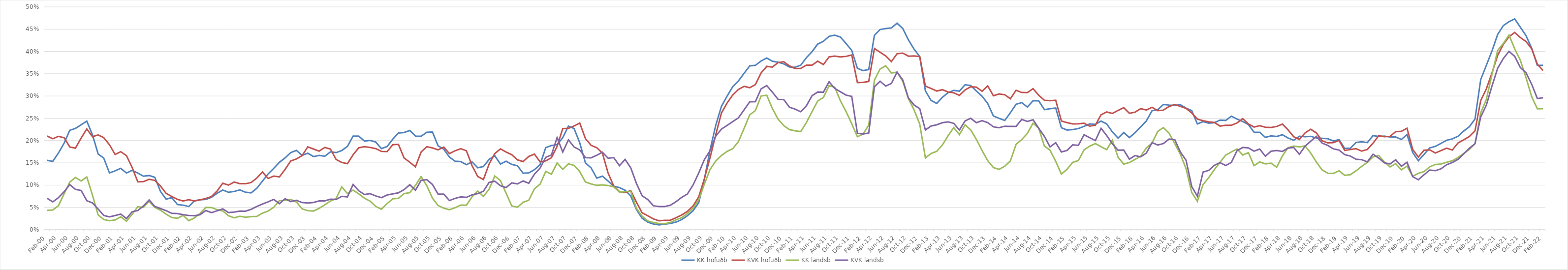
| Category | KK höfuðb | KVK höfuðb | KK landsb | KVK landsb |
|---|---|---|---|---|
| feb.00 | 0.156 | 0.21 | 0.043 | 0.07 |
| mar.00 | 0.153 | 0.204 | 0.044 | 0.062 |
| apr.00 | 0.172 | 0.209 | 0.054 | 0.072 |
| maí.00 | 0.194 | 0.206 | 0.081 | 0.085 |
| jún.00 | 0.223 | 0.186 | 0.107 | 0.101 |
| júl.00 | 0.227 | 0.183 | 0.117 | 0.09 |
| ágú.00 | 0.235 | 0.205 | 0.109 | 0.088 |
| sep.00 | 0.244 | 0.226 | 0.118 | 0.065 |
| okt.00 | 0.213 | 0.209 | 0.077 | 0.06 |
| nóv.00 | 0.17 | 0.213 | 0.033 | 0.046 |
| des.00 | 0.16 | 0.206 | 0.023 | 0.032 |
| jan.01 | 0.127 | 0.191 | 0.02 | 0.029 |
| feb.01 | 0.132 | 0.169 | 0.022 | 0.032 |
| mar.01 | 0.138 | 0.175 | 0.029 | 0.035 |
| apr.01 | 0.127 | 0.166 | 0.019 | 0.025 |
| maí.01 | 0.133 | 0.14 | 0.034 | 0.04 |
| jún.01 | 0.127 | 0.107 | 0.051 | 0.043 |
| júl.01 | 0.12 | 0.108 | 0.05 | 0.053 |
| ágú.01 | 0.122 | 0.113 | 0.063 | 0.067 |
| sep.01 | 0.118 | 0.111 | 0.05 | 0.052 |
| okt.01 | 0.086 | 0.098 | 0.044 | 0.047 |
| nóv.01 | 0.068 | 0.081 | 0.035 | 0.043 |
| des.01 | 0.072 | 0.074 | 0.027 | 0.037 |
| jan.02 | 0.056 | 0.068 | 0.026 | 0.036 |
| feb.02 | 0.055 | 0.064 | 0.032 | 0.034 |
| mar.02 | 0.052 | 0.067 | 0.02 | 0.032 |
| apr.02 | 0.065 | 0.064 | 0.026 | 0.031 |
| maí.02 | 0.067 | 0.067 | 0.037 | 0.034 |
| jún.02 | 0.068 | 0.07 | 0.05 | 0.043 |
| júl.02 | 0.073 | 0.074 | 0.05 | 0.038 |
| ágú.02 | 0.082 | 0.087 | 0.045 | 0.042 |
| sep.02 | 0.089 | 0.104 | 0.042 | 0.047 |
| okt.02 | 0.084 | 0.1 | 0.031 | 0.038 |
| nóv.02 | 0.086 | 0.107 | 0.027 | 0.039 |
| des.02 | 0.089 | 0.103 | 0.03 | 0.042 |
| jan.03 | 0.084 | 0.103 | 0.028 | 0.042 |
| feb.03 | 0.083 | 0.106 | 0.029 | 0.046 |
| mar.03 | 0.093 | 0.116 | 0.03 | 0.052 |
| apr.03 | 0.109 | 0.129 | 0.037 | 0.058 |
| maí.03 | 0.125 | 0.115 | 0.042 | 0.062 |
| jún.03 | 0.138 | 0.12 | 0.05 | 0.068 |
| júl.03 | 0.151 | 0.118 | 0.065 | 0.059 |
| ágú.03 | 0.161 | 0.135 | 0.066 | 0.069 |
| sep.03 | 0.173 | 0.154 | 0.068 | 0.063 |
| okt.03 | 0.178 | 0.159 | 0.062 | 0.066 |
| nóv.03 | 0.167 | 0.166 | 0.047 | 0.061 |
| des.03 | 0.172 | 0.186 | 0.043 | 0.06 |
| jan.04 | 0.164 | 0.181 | 0.042 | 0.061 |
| feb.04 | 0.167 | 0.176 | 0.048 | 0.064 |
| mar.04 | 0.165 | 0.185 | 0.056 | 0.065 |
| apr.04 | 0.175 | 0.181 | 0.064 | 0.068 |
| maí.04 | 0.173 | 0.158 | 0.07 | 0.068 |
| jún.04 | 0.178 | 0.151 | 0.096 | 0.075 |
| júl.04 | 0.187 | 0.148 | 0.081 | 0.074 |
| ágú.04 | 0.21 | 0.168 | 0.089 | 0.101 |
| sep.04 | 0.21 | 0.184 | 0.08 | 0.087 |
| okt.04 | 0.199 | 0.186 | 0.071 | 0.079 |
| nóv.04 | 0.2 | 0.185 | 0.064 | 0.081 |
| des.04 | 0.197 | 0.182 | 0.052 | 0.076 |
| jan.05 | 0.182 | 0.176 | 0.046 | 0.072 |
| feb.05 | 0.187 | 0.175 | 0.059 | 0.078 |
| mar.05 | 0.203 | 0.191 | 0.069 | 0.08 |
| apr.05 | 0.217 | 0.191 | 0.07 | 0.083 |
| maí.05 | 0.218 | 0.161 | 0.081 | 0.09 |
| jún.05 | 0.223 | 0.151 | 0.083 | 0.101 |
| júl.05 | 0.21 | 0.141 | 0.099 | 0.089 |
| ágú.05 | 0.21 | 0.174 | 0.119 | 0.111 |
| sep.05 | 0.219 | 0.186 | 0.099 | 0.112 |
| okt.05 | 0.219 | 0.184 | 0.071 | 0.102 |
| nóv.05 | 0.188 | 0.179 | 0.054 | 0.08 |
| des.05 | 0.181 | 0.185 | 0.048 | 0.08 |
| jan.06 | 0.163 | 0.171 | 0.045 | 0.065 |
| feb.06 | 0.154 | 0.177 | 0.049 | 0.07 |
| mar.06 | 0.153 | 0.182 | 0.055 | 0.074 |
| apr.06 | 0.146 | 0.177 | 0.055 | 0.072 |
| maí.06 | 0.152 | 0.143 | 0.074 | 0.078 |
| jún.06 | 0.139 | 0.119 | 0.087 | 0.081 |
| júl.06 | 0.142 | 0.113 | 0.075 | 0.086 |
| ágú.06 | 0.158 | 0.147 | 0.091 | 0.106 |
| sep.06 | 0.166 | 0.171 | 0.121 | 0.109 |
| okt.06 | 0.147 | 0.181 | 0.11 | 0.099 |
| nóv.06 | 0.154 | 0.174 | 0.082 | 0.094 |
| des.06 | 0.147 | 0.168 | 0.053 | 0.105 |
| jan.07 | 0.143 | 0.157 | 0.05 | 0.103 |
| feb.07 | 0.127 | 0.153 | 0.061 | 0.109 |
| mar.07 | 0.127 | 0.164 | 0.066 | 0.104 |
| apr.07 | 0.135 | 0.169 | 0.092 | 0.125 |
| maí.07 | 0.146 | 0.152 | 0.102 | 0.138 |
| jún.07 | 0.184 | 0.155 | 0.131 | 0.162 |
| júl.07 | 0.189 | 0.161 | 0.124 | 0.168 |
| ágú.07 | 0.191 | 0.187 | 0.15 | 0.207 |
| sep.07 | 0.207 | 0.227 | 0.136 | 0.174 |
| okt.07 | 0.232 | 0.227 | 0.148 | 0.202 |
| nóv.07 | 0.227 | 0.233 | 0.144 | 0.186 |
| des.07 | 0.195 | 0.239 | 0.13 | 0.179 |
| jan.08 | 0.15 | 0.204 | 0.107 | 0.162 |
| feb.08 | 0.139 | 0.189 | 0.103 | 0.161 |
| mar.08 | 0.116 | 0.184 | 0.099 | 0.167 |
| apr.08 | 0.12 | 0.172 | 0.101 | 0.174 |
| maí.08 | 0.109 | 0.127 | 0.099 | 0.16 |
| jún.08 | 0.098 | 0.098 | 0.096 | 0.162 |
| júl.08 | 0.094 | 0.085 | 0.084 | 0.144 |
| ágú.08 | 0.089 | 0.083 | 0.085 | 0.158 |
| sep.08 | 0.076 | 0.088 | 0.086 | 0.139 |
| okt.08 | 0.045 | 0.062 | 0.048 | 0.104 |
| nóv.08 | 0.026 | 0.038 | 0.03 | 0.076 |
| des.08 | 0.017 | 0.031 | 0.02 | 0.068 |
| jan.09 | 0.013 | 0.024 | 0.016 | 0.054 |
| feb.09 | 0.011 | 0.02 | 0.014 | 0.052 |
| mar.09 | 0.012 | 0.021 | 0.013 | 0.052 |
| apr.09 | 0.014 | 0.021 | 0.016 | 0.055 |
| maí.09 | 0.017 | 0.027 | 0.022 | 0.063 |
| jún.09 | 0.023 | 0.033 | 0.027 | 0.073 |
| júl.09 | 0.031 | 0.041 | 0.036 | 0.08 |
| ágú.09 | 0.043 | 0.053 | 0.048 | 0.1 |
| sep.09 | 0.061 | 0.074 | 0.067 | 0.127 |
| okt.09 | 0.114 | 0.115 | 0.102 | 0.157 |
| nóv.09 | 0.179 | 0.162 | 0.135 | 0.177 |
| des.09 | 0.234 | 0.213 | 0.154 | 0.21 |
| jan.10 | 0.277 | 0.262 | 0.166 | 0.226 |
| feb.10 | 0.3 | 0.284 | 0.176 | 0.234 |
| mar.10 | 0.321 | 0.302 | 0.182 | 0.243 |
| apr.10 | 0.334 | 0.315 | 0.198 | 0.251 |
| maí.10 | 0.351 | 0.322 | 0.227 | 0.269 |
| jún.10 | 0.368 | 0.319 | 0.258 | 0.287 |
| júl.10 | 0.369 | 0.326 | 0.267 | 0.287 |
| ágú.10 | 0.379 | 0.352 | 0.3 | 0.316 |
| sep.10 | 0.385 | 0.367 | 0.302 | 0.324 |
| okt.10 | 0.378 | 0.365 | 0.272 | 0.309 |
| nóv.10 | 0.376 | 0.375 | 0.248 | 0.293 |
| des.10 | 0.372 | 0.377 | 0.233 | 0.292 |
| jan.11 | 0.365 | 0.368 | 0.225 | 0.275 |
| feb.11 | 0.365 | 0.362 | 0.222 | 0.271 |
| mar.11 | 0.369 | 0.362 | 0.22 | 0.265 |
| apr.11 | 0.386 | 0.369 | 0.24 | 0.278 |
| maí.11 | 0.4 | 0.369 | 0.265 | 0.301 |
| jún.11 | 0.417 | 0.378 | 0.289 | 0.309 |
| júl.11 | 0.423 | 0.37 | 0.297 | 0.308 |
| ágú.11 | 0.434 | 0.388 | 0.323 | 0.332 |
| sep.11 | 0.436 | 0.39 | 0.32 | 0.317 |
| okt.11 | 0.432 | 0.388 | 0.289 | 0.309 |
| nóv.11 | 0.418 | 0.389 | 0.265 | 0.302 |
| des.11 | 0.402 | 0.392 | 0.238 | 0.299 |
| jan.12 | 0.362 | 0.33 | 0.209 | 0.216 |
| feb.12 | 0.357 | 0.331 | 0.215 | 0.215 |
| mar.12 | 0.359 | 0.333 | 0.234 | 0.217 |
| apr.12 | 0.436 | 0.407 | 0.336 | 0.321 |
| maí.12 | 0.449 | 0.398 | 0.361 | 0.333 |
| jún.12 | 0.451 | 0.39 | 0.368 | 0.322 |
| júl.12 | 0.453 | 0.377 | 0.352 | 0.328 |
| ágú.12 | 0.463 | 0.395 | 0.354 | 0.354 |
| sep.12 | 0.452 | 0.396 | 0.333 | 0.336 |
| okt.12 | 0.426 | 0.389 | 0.294 | 0.295 |
| nóv.12 | 0.405 | 0.39 | 0.269 | 0.28 |
| des.12 | 0.388 | 0.389 | 0.237 | 0.272 |
| jan.13 | 0.312 | 0.322 | 0.161 | 0.224 |
| feb.13 | 0.29 | 0.317 | 0.171 | 0.233 |
| mar.13 | 0.283 | 0.311 | 0.176 | 0.235 |
| apr.13 | 0.297 | 0.314 | 0.19 | 0.24 |
| maí.13 | 0.307 | 0.309 | 0.211 | 0.242 |
| jún.13 | 0.313 | 0.307 | 0.229 | 0.239 |
| júl.13 | 0.311 | 0.301 | 0.214 | 0.224 |
| ágú.13 | 0.325 | 0.314 | 0.235 | 0.244 |
| sep.13 | 0.323 | 0.321 | 0.224 | 0.25 |
| okt.13 | 0.311 | 0.32 | 0.203 | 0.24 |
| nóv.13 | 0.3 | 0.311 | 0.178 | 0.245 |
| des.13 | 0.283 | 0.323 | 0.155 | 0.24 |
| jan.14 | 0.255 | 0.301 | 0.139 | 0.231 |
| feb.14 | 0.25 | 0.305 | 0.135 | 0.229 |
| mar.14 | 0.245 | 0.303 | 0.142 | 0.232 |
| apr.14 | 0.262 | 0.294 | 0.154 | 0.232 |
| maí.14 | 0.281 | 0.313 | 0.191 | 0.232 |
| jún.14 | 0.285 | 0.308 | 0.202 | 0.248 |
| júl.14 | 0.275 | 0.308 | 0.216 | 0.243 |
| ágú.14 | 0.289 | 0.316 | 0.239 | 0.247 |
| sep.14 | 0.289 | 0.302 | 0.227 | 0.228 |
| okt.14 | 0.269 | 0.291 | 0.188 | 0.209 |
| nóv.14 | 0.272 | 0.289 | 0.178 | 0.186 |
| des.14 | 0.273 | 0.29 | 0.153 | 0.195 |
| jan.15 | 0.229 | 0.244 | 0.125 | 0.174 |
| feb.15 | 0.224 | 0.24 | 0.136 | 0.178 |
| mar.15 | 0.225 | 0.237 | 0.151 | 0.19 |
| apr.15 | 0.227 | 0.238 | 0.155 | 0.189 |
| maí.15 | 0.232 | 0.239 | 0.179 | 0.213 |
| jún.15 | 0.237 | 0.232 | 0.188 | 0.206 |
| júl.15 | 0.236 | 0.234 | 0.193 | 0.2 |
| ágú.15 | 0.244 | 0.258 | 0.186 | 0.228 |
| sep.15 | 0.238 | 0.264 | 0.18 | 0.211 |
| okt.15 | 0.219 | 0.261 | 0.201 | 0.192 |
| nóv.15 | 0.206 | 0.268 | 0.163 | 0.178 |
| des.15 | 0.218 | 0.274 | 0.147 | 0.179 |
| jan.16 | 0.207 | 0.261 | 0.151 | 0.158 |
| feb.16 | 0.218 | 0.264 | 0.158 | 0.166 |
| mar.16 | 0.231 | 0.272 | 0.165 | 0.163 |
| apr.16 | 0.244 | 0.269 | 0.183 | 0.172 |
| maí.16 | 0.267 | 0.275 | 0.194 | 0.195 |
| jún.16 | 0.269 | 0.267 | 0.22 | 0.19 |
| júl.16 | 0.281 | 0.268 | 0.229 | 0.193 |
| ágú.16 | 0.28 | 0.276 | 0.217 | 0.203 |
| sep.16 | 0.279 | 0.281 | 0.193 | 0.202 |
| okt.16 | 0.28 | 0.277 | 0.169 | 0.174 |
| nóv.16 | 0.273 | 0.272 | 0.137 | 0.156 |
| des.16 | 0.267 | 0.262 | 0.084 | 0.097 |
| jan.17 | 0.237 | 0.248 | 0.064 | 0.075 |
| feb.17 | 0.243 | 0.244 | 0.101 | 0.129 |
| mar.17 | 0.239 | 0.242 | 0.117 | 0.133 |
| apr.17 | 0.24 | 0.241 | 0.135 | 0.144 |
| maí.17 | 0.246 | 0.233 | 0.151 | 0.151 |
| jún.17 | 0.245 | 0.234 | 0.167 | 0.144 |
| júl.17 | 0.255 | 0.234 | 0.174 | 0.151 |
| ágú.17 | 0.248 | 0.239 | 0.181 | 0.177 |
| sep.17 | 0.243 | 0.249 | 0.168 | 0.184 |
| okt.17 | 0.236 | 0.237 | 0.173 | 0.183 |
| nóv.17 | 0.219 | 0.23 | 0.144 | 0.176 |
| des.17 | 0.219 | 0.233 | 0.152 | 0.181 |
| jan.18 | 0.207 | 0.23 | 0.148 | 0.165 |
| feb.18 | 0.21 | 0.229 | 0.149 | 0.176 |
| mar.18 | 0.209 | 0.232 | 0.14 | 0.178 |
| apr.18 | 0.213 | 0.237 | 0.166 | 0.176 |
| maí.18 | 0.206 | 0.224 | 0.184 | 0.183 |
| jún.18 | 0.201 | 0.209 | 0.188 | 0.185 |
| júl.18 | 0.21 | 0.202 | 0.186 | 0.169 |
| ágú.18 | 0.209 | 0.217 | 0.188 | 0.187 |
| sep.18 | 0.21 | 0.225 | 0.172 | 0.199 |
| okt.18 | 0.206 | 0.217 | 0.152 | 0.209 |
| nóv.18 | 0.205 | 0.199 | 0.134 | 0.194 |
| des.18 | 0.204 | 0.195 | 0.127 | 0.189 |
| jan.19 | 0.199 | 0.195 | 0.126 | 0.181 |
| feb.19 | 0.202 | 0.2 | 0.132 | 0.179 |
| mar.19 | 0.182 | 0.178 | 0.122 | 0.168 |
| apr.19 | 0.183 | 0.18 | 0.123 | 0.165 |
| maí.19 | 0.196 | 0.182 | 0.132 | 0.158 |
| jún.19 | 0.197 | 0.176 | 0.142 | 0.157 |
| júl.19 | 0.195 | 0.18 | 0.151 | 0.152 |
| ágú.19 | 0.211 | 0.194 | 0.163 | 0.169 |
| sep.19 | 0.209 | 0.211 | 0.167 | 0.161 |
| okt.19 | 0.21 | 0.209 | 0.152 | 0.15 |
| nóv.19 | 0.208 | 0.209 | 0.141 | 0.147 |
| des.19 | 0.208 | 0.22 | 0.148 | 0.157 |
| jan.20 | 0.202 | 0.221 | 0.134 | 0.142 |
| feb.20 | 0.213 | 0.228 | 0.143 | 0.151 |
| mars.20* | 0.173 | 0.18 | 0.12 | 0.119 |
| apr.20 | 0.155 | 0.163 | 0.126 | 0.112 |
| maí.20 | 0.169 | 0.178 | 0.13 | 0.123 |
| jún.20 | 0.183 | 0.179 | 0.141 | 0.134 |
| júl.20 | 0.187 | 0.172 | 0.146 | 0.132 |
| ágú.20 | 0.194 | 0.178 | 0.147 | 0.137 |
| sep.20 | 0.201 | 0.183 | 0.151 | 0.146 |
| okt.20 | 0.204 | 0.179 | 0.155 | 0.151 |
| nóv.20 | 0.21 | 0.195 | 0.162 | 0.158 |
| des.20 | 0.221 | 0.202 | 0.171 | 0.17 |
| jan.21 | 0.231 | 0.209 | 0.18 | 0.183 |
| feb.21 | 0.248 | 0.222 | 0.193 | 0.193 |
| mar.21 | 0.337 | 0.29 | 0.262 | 0.253 |
| apr.21 | 0.369 | 0.316 | 0.292 | 0.279 |
| maí.21 | 0.402 | 0.352 | 0.349 | 0.323 |
| jún.21 | 0.438 | 0.392 | 0.403 | 0.362 |
| júl.21 | 0.458 | 0.416 | 0.418 | 0.384 |
| ágú.21 | 0.467 | 0.433 | 0.437 | 0.4 |
| sep.21 | 0.473 | 0.443 | 0.406 | 0.389 |
| okt.21 | 0.454 | 0.431 | 0.38 | 0.364 |
| nóv.21 | 0.435 | 0.422 | 0.341 | 0.352 |
| des.21 | 0.407 | 0.406 | 0.298 | 0.326 |
| jan.22 | 0.369 | 0.371 | 0.271 | 0.294 |
| feb.22 | 0.369 | 0.357 | 0.271 | 0.296 |